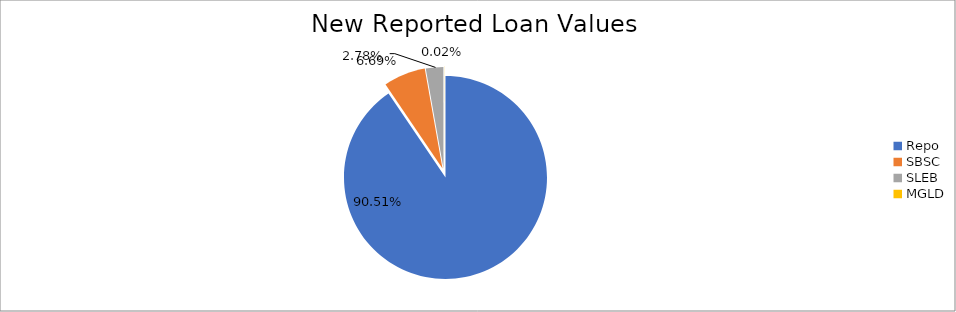
| Category | Series 0 |
|---|---|
| Repo | 11851846.475 |
| SBSC | 875330.379 |
| SLEB | 363943.555 |
| MGLD | 2785.261 |